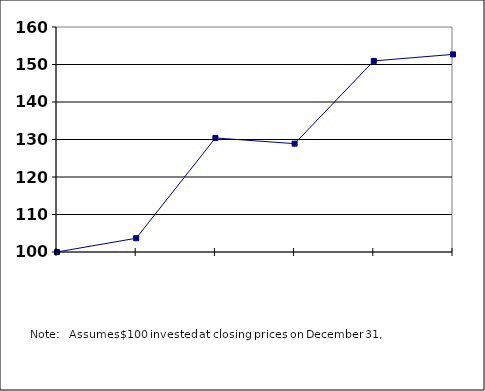
| Category | Series 0 |
|---|---|
| nan | 100 |
| 2018.0 | 103.674 |
| 2019.0 | 130.411 |
| 2020.0 | 128.894 |
| 2021.0 | 150.958 |
| 2022.0 | 152.699 |